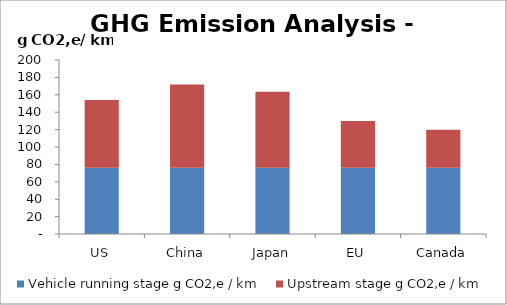
| Category | Vehicle running stage | Upstream stage |
|---|---|---|
| US | 76.059 | 77.844 |
| China | 76.059 | 95.69 |
| Japan | 76.059 | 87.313 |
| EU | 76.059 | 53.93 |
| Canada | 76.059 | 43.699 |